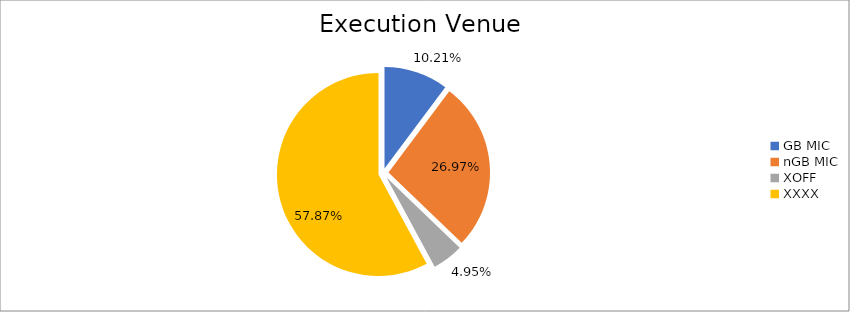
| Category | Series 0 |
|---|---|
| GB MIC | 951644.618 |
| nGB MIC | 2513091.345 |
| XOFF | 460845.304 |
| XXXX | 5392992.477 |